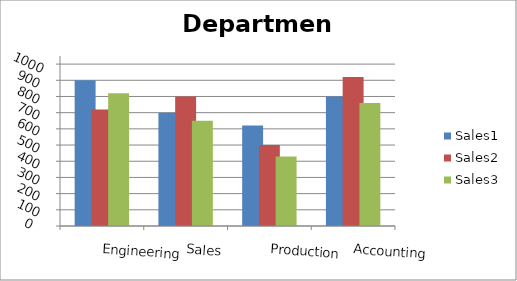
| Category | Sales1 | Sales2 | Sales3 |
|---|---|---|---|
| Engineering | 900 | 720 | 820 |
| Sales | 700 | 800 | 650 |
| Production | 620 | 500 | 430 |
| Accounting | 800 | 920 | 760 |